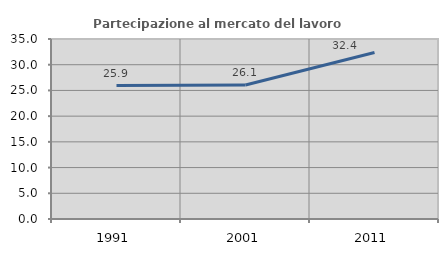
| Category | Partecipazione al mercato del lavoro  femminile |
|---|---|
| 1991.0 | 25.949 |
| 2001.0 | 26.059 |
| 2011.0 | 32.389 |